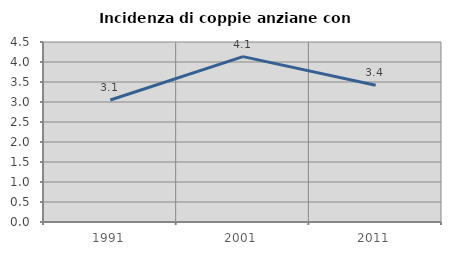
| Category | Incidenza di coppie anziane con figli |
|---|---|
| 1991.0 | 3.051 |
| 2001.0 | 4.135 |
| 2011.0 | 3.418 |